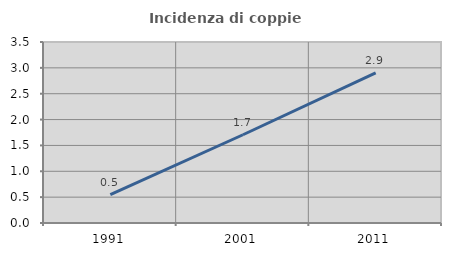
| Category | Incidenza di coppie miste |
|---|---|
| 1991.0 | 0.548 |
| 2001.0 | 1.706 |
| 2011.0 | 2.905 |